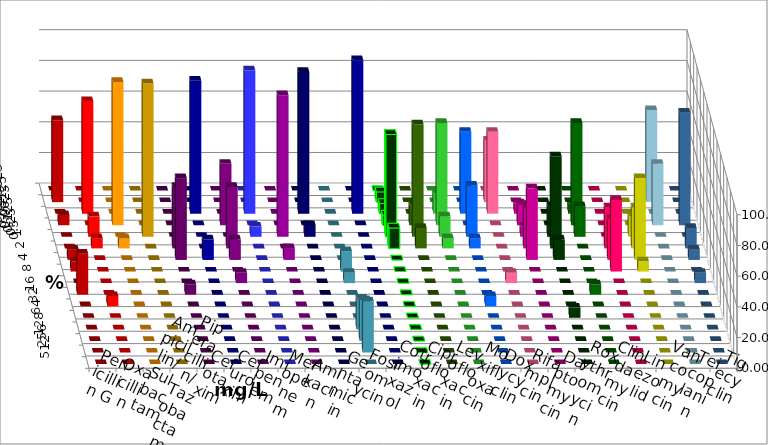
| Category | Penicillin G | Oxacillin | Ampicillin/ Sulbactam | Piperacillin/ Tazobactam | Cefotaxim | Cefuroxim | Imipenem | Meropenem | Amikacin | Gentamicin | Fosfomycin | Cotrimoxazol | Ciprofloxacin | Levofloxacin | Moxifloxacin | Doxycyclin | Rifampicin | Daptomycin | Roxythromycin | Clindamycin | Linezolid | Vancomycin | Teicoplanin | Tigecyclin |
|---|---|---|---|---|---|---|---|---|---|---|---|---|---|---|---|---|---|---|---|---|---|---|---|---|
| 0.015625 | 0 | 0 | 0 | 0 | 0 | 0 | 0 | 0 | 0 | 0 | 0 | 0 | 0 | 0 | 0 | 0 | 0 | 0 | 0 | 0 | 0 | 0 | 0 | 0 |
| 0.03125 | 53.333 | 0 | 0 | 0 | 0 | 0 | 0 | 0 | 0 | 0 | 0 | 0 | 6.667 | 0 | 0 | 0 | 40 | 0 | 0 | 0 | 0 | 0 | 0 | 60 |
| 0.0625 | 0 | 73.333 | 0 | 0 | 0 | 0 | 86.667 | 93.333 | 0 | 92.308 | 0 | 100 | 6.667 | 0 | 13.333 | 53.333 | 53.333 | 6.667 | 0 | 6.667 | 0 | 0 | 0 | 0 |
| 0.125 | 6.667 | 0 | 93.333 | 0 | 0 | 40 | 0 | 0 | 0 | 0 | 0 | 0 | 6.667 | 13.333 | 66.667 | 0 | 0 | 13.333 | 0 | 66.667 | 0 | 0 | 73.333 | 40 |
| 0.25 | 0 | 13.333 | 0 | 100 | 0 | 0 | 0 | 6.667 | 92.308 | 7.692 | 0 | 0 | 66.667 | 73.333 | 13.333 | 33.333 | 0 | 6.667 | 20 | 20 | 0 | 13.333 | 0 | 0 |
| 0.5 | 0 | 6.667 | 6.667 | 0 | 40 | 40 | 0 | 0 | 0 | 0 | 0 | 0 | 13.333 | 13.333 | 6.667 | 6.667 | 0 | 26.667 | 60 | 0 | 26.667 | 26.667 | 13.333 | 0 |
| 1.0 | 6.667 | 0 | 0 | 0 | 53.333 | 13.333 | 13.333 | 0 | 7.692 | 0 | 0 | 0 | 0 | 0 | 0 | 0 | 0 | 46.667 | 13.333 | 0 | 26.667 | 53.333 | 6.667 | 0 |
| 2.0 | 6.667 | 0 | 0 | 0 | 0 | 0 | 0 | 0 | 0 | 0 | 13.333 | 0 | 0 | 0 | 0 | 0 | 0 | 0 | 0 | 0 | 46.667 | 6.667 | 0 | 0 |
| 4.0 | 0 | 0 | 0 | 0 | 0 | 6.667 | 0 | 0 | 0 | 0 | 6.667 | 0 | 0 | 0 | 0 | 0 | 6.667 | 0 | 0 | 0 | 0 | 0 | 6.667 | 0 |
| 8.0 | 26.667 | 0 | 0 | 0 | 6.667 | 0 | 0 | 0 | 0 | 0 | 0 | 0 | 0 | 0 | 0 | 0 | 0 | 0 | 0 | 6.667 | 0 | 0 | 0 | 0 |
| 16.0 | 0 | 6.667 | 0 | 0 | 0 | 0 | 0 | 0 | 0 | 0 | 0 | 0 | 0 | 0 | 0 | 6.667 | 0 | 0 | 0 | 0 | 0 | 0 | 0 | 0 |
| 32.0 | 0 | 0 | 0 | 0 | 0 | 0 | 0 | 0 | 0 | 0 | 0 | 0 | 0 | 0 | 0 | 0 | 0 | 0 | 6.667 | 0 | 0 | 0 | 0 | 0 |
| 64.0 | 0 | 0 | 0 | 0 | 0 | 0 | 0 | 0 | 0 | 0 | 20 | 0 | 0 | 0 | 0 | 0 | 0 | 0 | 0 | 0 | 0 | 0 | 0 | 0 |
| 128.0 | 0 | 0 | 0 | 0 | 0 | 0 | 0 | 0 | 0 | 0 | 26.667 | 0 | 0 | 0 | 0 | 0 | 0 | 0 | 0 | 0 | 0 | 0 | 0 | 0 |
| 256.0 | 0 | 0 | 0 | 0 | 0 | 0 | 0 | 0 | 0 | 0 | 33.333 | 0 | 0 | 0 | 0 | 0 | 0 | 0 | 0 | 0 | 0 | 0 | 0 | 0 |
| 512.0 | 0 | 0 | 0 | 0 | 0 | 0 | 0 | 0 | 0 | 0 | 0 | 0 | 0 | 0 | 0 | 0 | 0 | 0 | 0 | 0 | 0 | 0 | 0 | 0 |